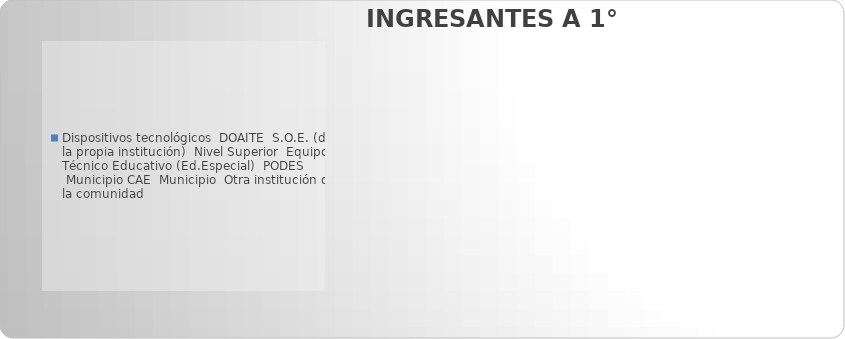
| Category | Dispositivos tecnológicos |
|---|---|
| Dispositivos tecnológicos | 0 |
|  DOAITE | 0 |
|  S.O.E. (de la propia institución) | 0 |
|  Nivel Superior | 0 |
|  Equipo Técnico Educativo (Ed.Especial) | 0 |
|  PODES | 0 |
|  Municipio CAE | 0 |
|  Municipio | 0 |
|  Otra institución de la comunidad | 0 |